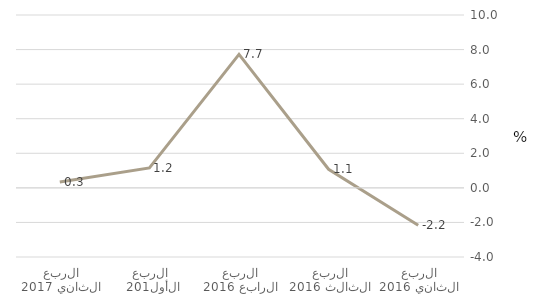
| Category | الإدارة العامة والدفاع؛ الضمان الاجتماعي الإجباري |
|---|---|
| الربع الثاني 2016 | -2.164 |
| الربع الثالث 2016 | 1.076 |
| الربع الرابع 2016 | 7.722 |
| الربع الأول 2017 | 1.156 |
| الربع الثاني 2017 | 0.344 |